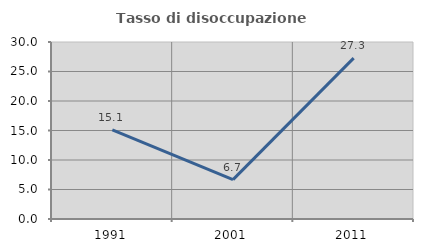
| Category | Tasso di disoccupazione giovanile  |
|---|---|
| 1991.0 | 15.094 |
| 2001.0 | 6.667 |
| 2011.0 | 27.273 |